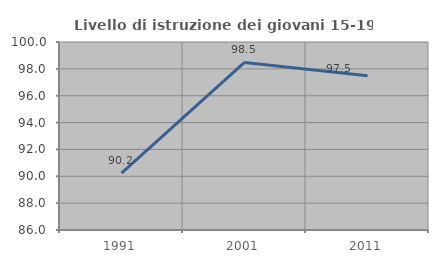
| Category | Livello di istruzione dei giovani 15-19 anni |
|---|---|
| 1991.0 | 90.23 |
| 2001.0 | 98.477 |
| 2011.0 | 97.49 |